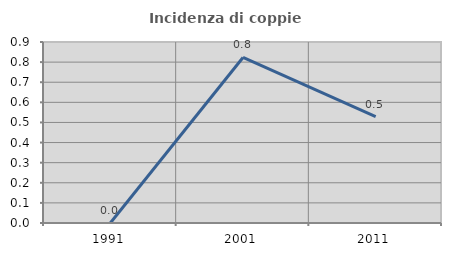
| Category | Incidenza di coppie miste |
|---|---|
| 1991.0 | 0 |
| 2001.0 | 0.823 |
| 2011.0 | 0.529 |